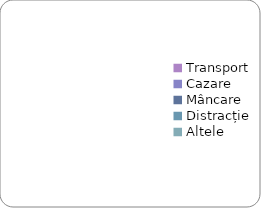
| Category | Series 0 |
|---|---|
| Transport | 0 |
| Cazare | 0 |
| Mâncare | 0 |
| Distracție | 0 |
| Altele | 0 |